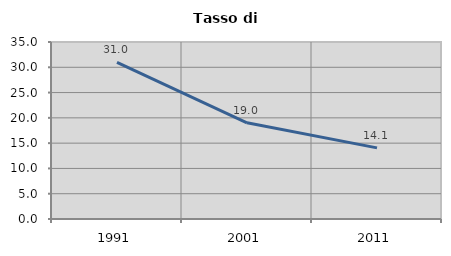
| Category | Tasso di disoccupazione   |
|---|---|
| 1991.0 | 30.982 |
| 2001.0 | 19.013 |
| 2011.0 | 14.067 |